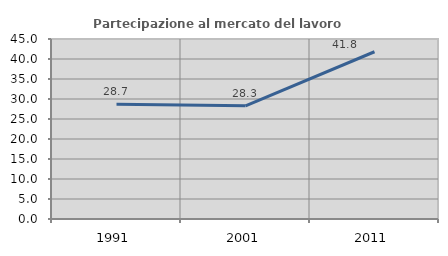
| Category | Partecipazione al mercato del lavoro  femminile |
|---|---|
| 1991.0 | 28.698 |
| 2001.0 | 28.299 |
| 2011.0 | 41.811 |